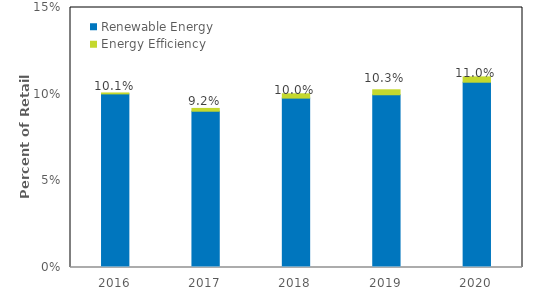
| Category | Renewable Energy | Energy Efficiency |
|---|---|---|
| 2016.0 | 0.1 | 0.001 |
| 2017.0 | 0.09 | 0.002 |
| 2018.0 | 0.098 | 0.003 |
| 2019.0 | 0.1 | 0.003 |
| 2020.0 | 0.107 | 0.003 |